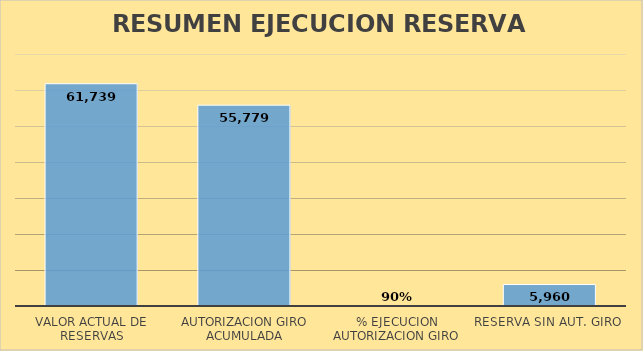
| Category | 3 |
|---|---|
| VALOR ACTUAL DE RESERVAS | 61739.197 |
| AUTORIZACION GIRO ACUMULADA | 55779.37 |
| % EJECUCION AUTORIZACION GIRO | 0.903 |
| RESERVA SIN AUT. GIRO | 5959.827 |